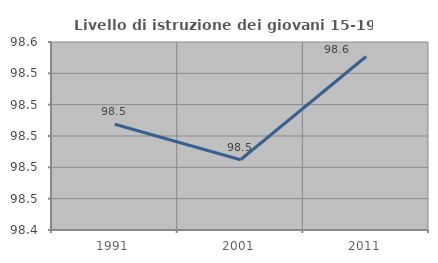
| Category | Livello di istruzione dei giovani 15-19 anni |
|---|---|
| 1991.0 | 98.507 |
| 2001.0 | 98.485 |
| 2011.0 | 98.551 |